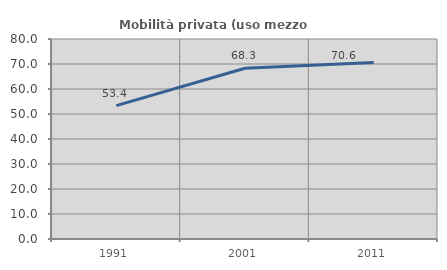
| Category | Mobilità privata (uso mezzo privato) |
|---|---|
| 1991.0 | 53.374 |
| 2001.0 | 68.319 |
| 2011.0 | 70.617 |